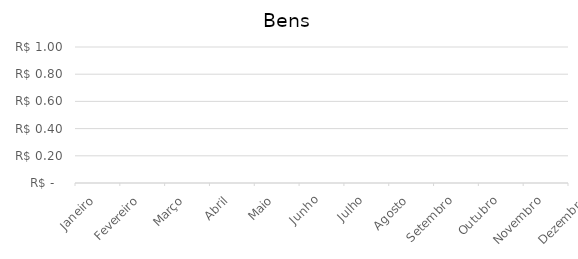
| Category | Bens |
|---|---|
| Janeiro | 0 |
| Fevereiro | 0 |
| Março | 0 |
| Abril | 0 |
| Maio | 0 |
| Junho | 0 |
| Julho | 0 |
| Agosto | 0 |
| Setembro | 0 |
| Outubro | 0 |
| Novembro | 0 |
| Dezembro | 0 |